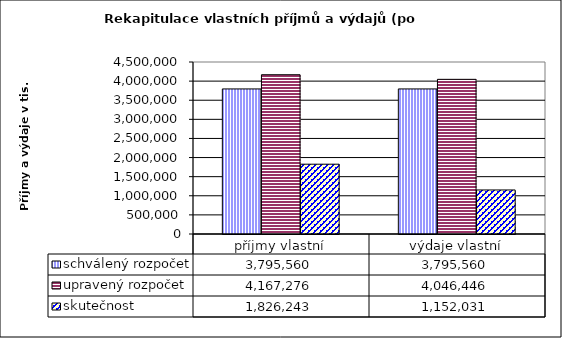
| Category | schválený rozpočet | upravený rozpočet | skutečnost |
|---|---|---|---|
| příjmy vlastní | 3795560 | 4167276 | 1826243 |
| výdaje vlastní | 3795560 | 4046446 | 1152031 |